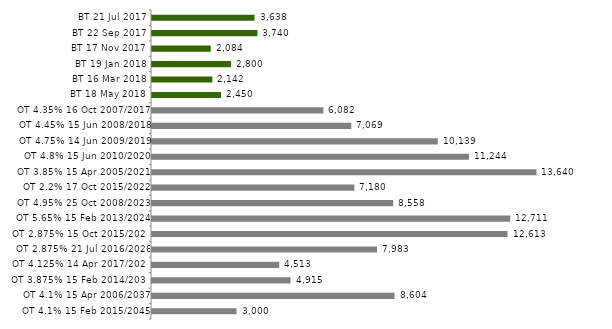
| Category | Series 0 |
|---|---|
| BT 21 Jul 2017 | 3637.507 |
| BT 22 Sep 2017 | 3740.471 |
| BT 17 Nov 2017 | 2083.545 |
| BT 19 Jan 2018 | 2800.288 |
| BT 16 Mar 2018 | 2142.007 |
| BT 18 May 2018 | 2450.013 |
| OT 4.35% 16 Oct 2007/2017 | 6081.646 |
| OT 4.45% 15 Jun 2008/2018 | 7069.135 |
| OT 4.75% 14 Jun 2009/2019 | 10138.75 |
| OT 4.8% 15 Jun 2010/2020 | 11243.696 |
| OT 3.85% 15 Apr 2005/2021 | 13639.958 |
| OT 2.2% 17 Oct 2015/2022 | 7179.553 |
| OT 4.95% 25 Oct 2008/2023 | 8557.734 |
| OT 5.65% 15 Feb 2013/2024 | 12711.355 |
| OT 2.875% 15 Oct 2015/2025 | 12613.263 |
| OT 2.875% 21 Jul 2016/2026 | 7982.982 |
| OT 4.125% 14 Apr 2017/2027 | 4512.96 |
| OT 3.875% 15 Feb 2014/2030 | 4914.902 |
| OT 4.1% 15 Apr 2006/2037 | 8604.325 |
| OT 4.1% 15 Feb 2015/2045 | 3000 |